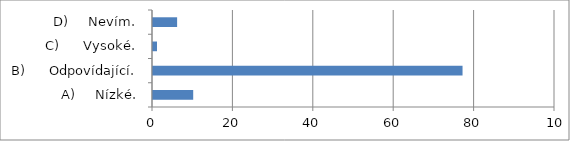
| Category | Series 0 |
|---|---|
| A)     Nízké. | 10 |
| B)      Odpovídající. | 77 |
| C)      Vysoké. | 1 |
| D)     Nevím. | 6 |